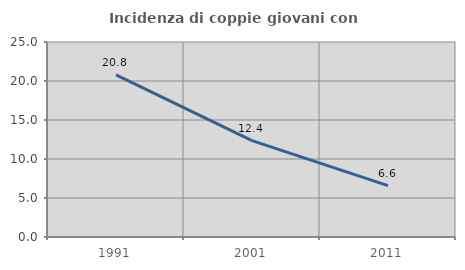
| Category | Incidenza di coppie giovani con figli |
|---|---|
| 1991.0 | 20.778 |
| 2001.0 | 12.353 |
| 2011.0 | 6.585 |